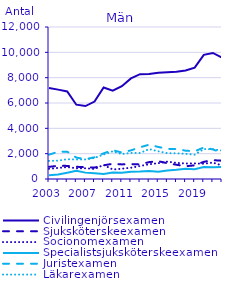
| Category | Civilingenjörsexamen                               | Sjuksköterskeexamen                                | Socionomexamen                                     | Specialistsjuksköterskeexamen                      | Juristexamen                                       | Läkarexamen                                        |
|---|---|---|---|---|---|---|
| 2003.0 | 7186 | 962 | 808 | 302 | 1921 | 1428 |
| 2004.0 | 7055 | 1042 | 875 | 357 | 2147 | 1450 |
| 2005.0 | 6910 | 1035 | 942 | 498 | 2159 | 1561 |
| 2006.0 | 5866 | 966 | 848 | 648 | 1691 | 1540 |
| 2007.0 | 5761 | 928 | 844 | 503 | 1563 | 1544 |
| 2008.0 | 6111 | 901 | 792 | 463 | 1714 | 1661 |
| 2009.0 | 7223 | 1081 | 1107 | 398 | 2030 | 1936 |
| 2010.0 | 6976 | 1201 | 750 | 510 | 2275 | 2183 |
| 2011.0 | 7330 | 1153 | 812 | 499 | 2090 | 1970 |
| 2012.0 | 7942 | 1174 | 891 | 571 | 2262 | 2059 |
| 2013.0 | 8276 | 1150 | 1029 | 588 | 2507 | 2055 |
| 2014.0 | 8282 | 1333 | 1165 | 638 | 2706 | 2361 |
| 2015.0 | 8387 | 1405 | 1248 | 582 | 2531 | 2188 |
| 2016.0 | 8430 | 1244 | 1374 | 663 | 2381 | 2042 |
| 2017.0 | 8465 | 1127 | 1273 | 724 | 2364 | 2030 |
| 2018.0 | 8566 | 1009 | 1224 | 807 | 2238 | 1985 |
| 2019.0 | 8790 | 1076 | 1231 | 778 | 2188 | 1922 |
| 2020.0 | 9800 | 1357 | 1203 | 946 | 2486 | 2363 |
| 2021.0 | 9951 | 1487 | 1295 | 927 | 2335 | 2349 |
| 2022.0 | 9579 | 1444 | 1070 | 944 | 2064 | 2240 |